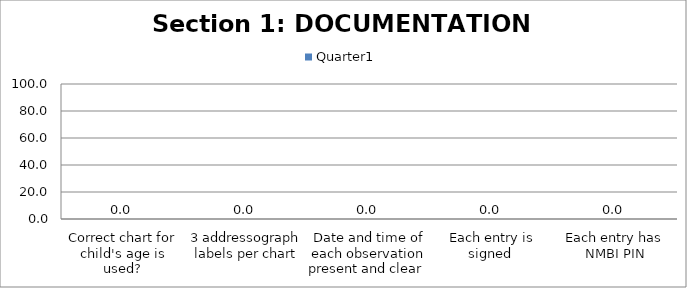
| Category | Quarter1 |
|---|---|
| Correct chart for child's age is used? | 0 |
| 3 addressograph labels per chart | 0 |
| Date and time of each observation present and clear  | 0 |
| Each entry is signed  | 0 |
| Each entry has NMBI PIN | 0 |